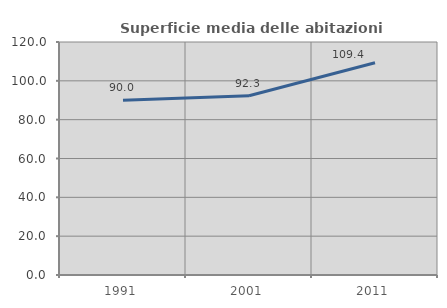
| Category | Superficie media delle abitazioni occupate |
|---|---|
| 1991.0 | 90.028 |
| 2001.0 | 92.346 |
| 2011.0 | 109.351 |